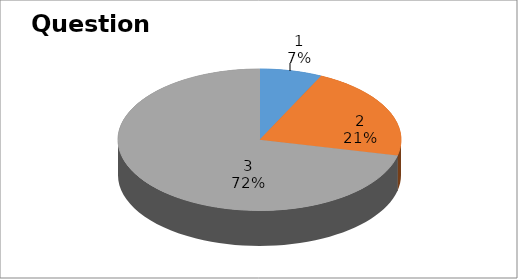
| Category | Series 0 |
|---|---|
| 0 | 2 |
| 1 | 6 |
| 2 | 20 |